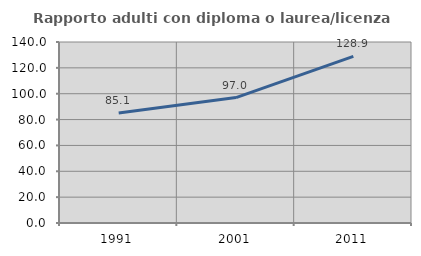
| Category | Rapporto adulti con diploma o laurea/licenza media  |
|---|---|
| 1991.0 | 85.057 |
| 2001.0 | 97.011 |
| 2011.0 | 128.945 |